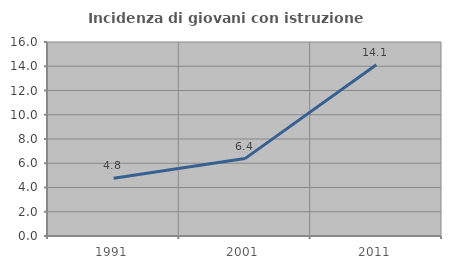
| Category | Incidenza di giovani con istruzione universitaria |
|---|---|
| 1991.0 | 4.762 |
| 2001.0 | 6.383 |
| 2011.0 | 14.13 |